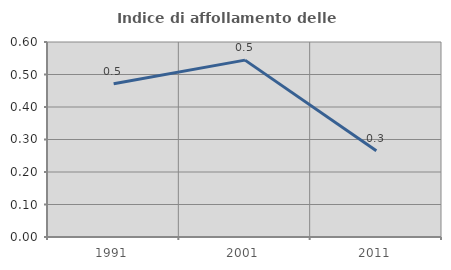
| Category | Indice di affollamento delle abitazioni  |
|---|---|
| 1991.0 | 0.472 |
| 2001.0 | 0.544 |
| 2011.0 | 0.265 |